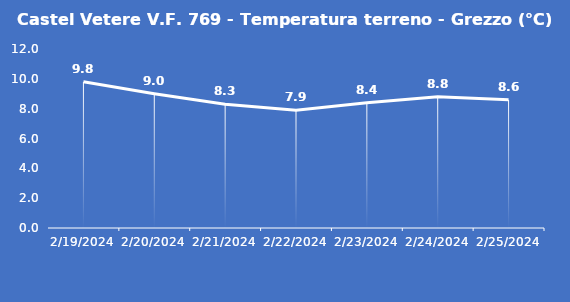
| Category | Castel Vetere V.F. 769 - Temperatura terreno - Grezzo (°C) |
|---|---|
| 2/19/24 | 9.8 |
| 2/20/24 | 9 |
| 2/21/24 | 8.3 |
| 2/22/24 | 7.9 |
| 2/23/24 | 8.4 |
| 2/24/24 | 8.8 |
| 2/25/24 | 8.6 |